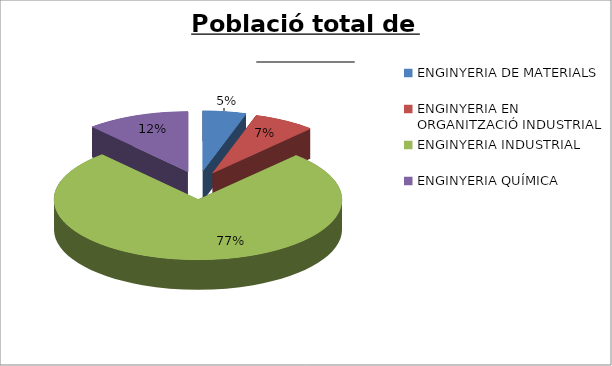
| Category | Series 0 |
|---|---|
| ENGINYERIA DE MATERIALS | 0.049 |
| ENGINYERIA EN ORGANITZACIÓ INDUSTRIAL | 0.07 |
| ENGINYERIA INDUSTRIAL | 0.766 |
| ENGINYERIA QUÍMICA | 0.116 |